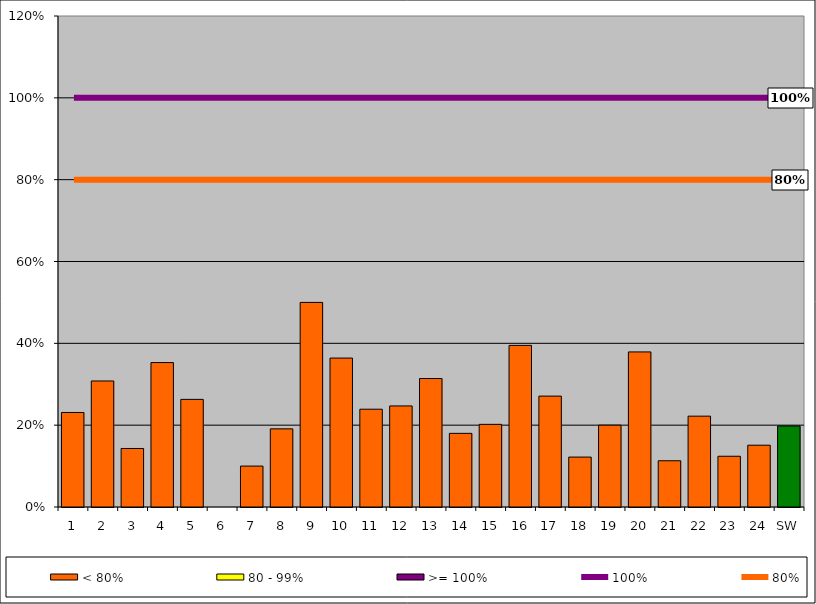
| Category | < 80% | 80 - 99% | >= 100% |
|---|---|---|---|
| 1 | 0.231 | 0 | 0 |
| 2 | 0.308 | 0 | 0 |
| 3 | 0.143 | 0 | 0 |
| 4 | 0.353 | 0 | 0 |
| 5 | 0.263 | 0 | 0 |
| 6 | 0 | 0 | 0 |
| 7 | 0.1 | 0 | 0 |
| 8 | 0.191 | 0 | 0 |
| 9 | 0.5 | 0 | 0 |
| 10 | 0.364 | 0 | 0 |
| 11 | 0.239 | 0 | 0 |
| 12 | 0.247 | 0 | 0 |
| 13 | 0.314 | 0 | 0 |
| 14 | 0.18 | 0 | 0 |
| 15 | 0.202 | 0 | 0 |
| 16 | 0.395 | 0 | 0 |
| 17 | 0.271 | 0 | 0 |
| 18 | 0.122 | 0 | 0 |
| 19 | 0.2 | 0 | 0 |
| 20 | 0.379 | 0 | 0 |
| 21 | 0.113 | 0 | 0 |
| 22 | 0.222 | 0 | 0 |
| 23 | 0.124 | 0 | 0 |
| 24 | 0.151 | 0 | 0 |
| SW | 0.198 | 0 | 0 |